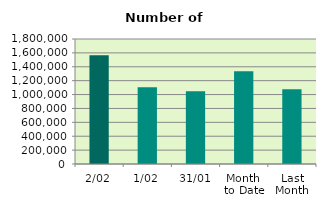
| Category | Series 0 |
|---|---|
| 2/02 | 1566926 |
| 1/02 | 1104202 |
| 31/01 | 1047848 |
| Month 
to Date | 1335564 |
| Last
Month | 1077187.636 |